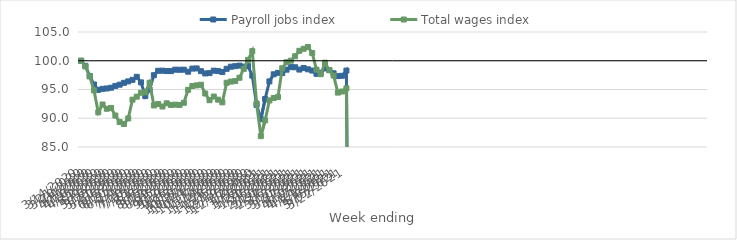
| Category | Payroll jobs index | Total wages index |
|---|---|---|
| 14/03/2020 | 100 | 100 |
| 21/03/2020 | 99.114 | 99.007 |
| 28/03/2020 | 97.349 | 97.269 |
| 04/04/2020 | 95.869 | 94.852 |
| 11/04/2020 | 94.936 | 91.032 |
| 18/04/2020 | 95.114 | 92.39 |
| 25/04/2020 | 95.181 | 91.65 |
| 02/05/2020 | 95.31 | 91.794 |
| 09/05/2020 | 95.619 | 90.47 |
| 16/05/2020 | 95.838 | 89.341 |
| 23/05/2020 | 96.161 | 88.997 |
| 30/05/2020 | 96.409 | 89.962 |
| 06/06/2020 | 96.682 | 93.236 |
| 13/06/2020 | 97.206 | 93.751 |
| 20/06/2020 | 96.234 | 94.436 |
| 27/06/2020 | 93.844 | 94.498 |
| 04/07/2020 | 94.982 | 96.17 |
| 11/07/2020 | 97.487 | 92.226 |
| 18/07/2020 | 98.254 | 92.482 |
| 25/07/2020 | 98.273 | 92.044 |
| 01/08/2020 | 98.211 | 92.6 |
| 08/08/2020 | 98.202 | 92.32 |
| 15/08/2020 | 98.45 | 92.367 |
| 22/08/2020 | 98.43 | 92.314 |
| 29/08/2020 | 98.446 | 92.684 |
| 05/09/2020 | 98.096 | 94.942 |
| 12/09/2020 | 98.637 | 95.607 |
| 19/09/2020 | 98.664 | 95.719 |
| 26/09/2020 | 98.188 | 95.831 |
| 03/10/2020 | 97.791 | 94.304 |
| 10/10/2020 | 97.853 | 93.143 |
| 17/10/2020 | 98.276 | 93.775 |
| 24/10/2020 | 98.199 | 93.229 |
| 31/10/2020 | 98.05 | 92.769 |
| 07/11/2020 | 98.595 | 96.169 |
| 14/11/2020 | 98.963 | 96.38 |
| 21/11/2020 | 99.056 | 96.462 |
| 28/11/2020 | 99.15 | 97.04 |
| 05/12/2020 | 98.974 | 98.589 |
| 12/12/2020 | 99.061 | 100.153 |
| 19/12/2020 | 97.412 | 101.666 |
| 26/12/2020 | 92.339 | 92.582 |
| 02/01/2021 | 89.854 | 86.89 |
| 09/01/2021 | 93.347 | 89.636 |
| 16/01/2021 | 96.408 | 93.098 |
| 23/01/2021 | 97.642 | 93.523 |
| 30/01/2021 | 97.895 | 93.692 |
| 06/02/2021 | 97.863 | 98.695 |
| 13/02/2021 | 98.448 | 99.739 |
| 20/02/2021 | 98.891 | 100.012 |
| 27/02/2021 | 98.868 | 100.785 |
| 06/03/2021 | 98.465 | 101.73 |
| 13/03/2021 | 98.746 | 102.084 |
| 20/03/2021 | 98.514 | 102.392 |
| 27/03/2021 | 98.295 | 101.345 |
| 03/04/2021 | 97.731 | 98.454 |
| 10/04/2021 | 97.928 | 97.654 |
| 17/04/2021 | 98.664 | 99.66 |
| 24/04/2021 | 98.383 | 98.348 |
| 01/05/2021 | 97.816 | 97.429 |
| 08/05/2021 | 97.33 | 94.464 |
| 15/05/2021 | 97.384 | 94.653 |
| 22/05/2021 | 98.287 | 95.204 |